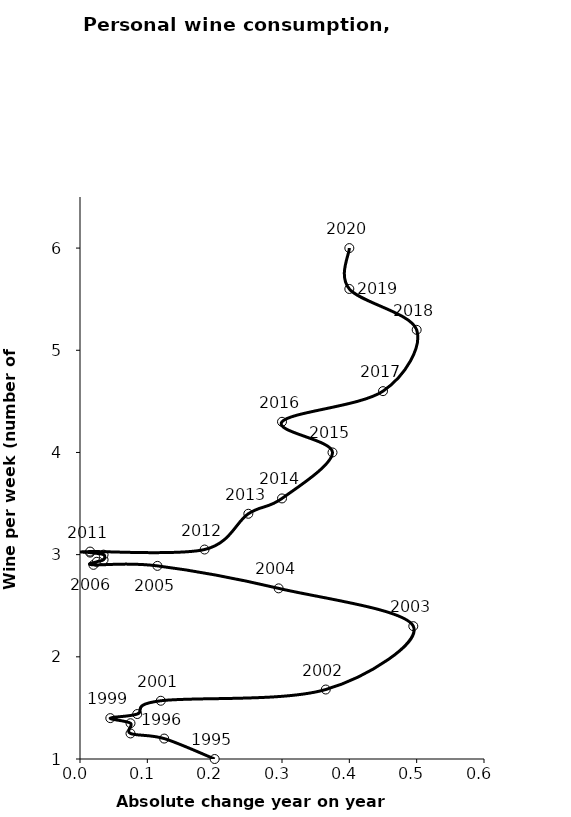
| Category | Series 0 |
|---|---|
| 0.19999999999999996 | 1 |
| 0.125 | 1.2 |
| 0.07500000000000007 | 1.25 |
| 0.07499999999999996 | 1.35 |
| 0.04499999999999993 | 1.4 |
| 0.08500000000000008 | 1.44 |
| 0.12 | 1.57 |
| 0.3649999999999999 | 1.68 |
| 0.495 | 2.3 |
| 0.29500000000000015 | 2.67 |
| 0.11499999999999999 | 2.89 |
| 0.020000000000000018 | 2.9 |
| 0.025000000000000133 | 2.93 |
| 0.03499999999999992 | 2.95 |
| 0.03499999999999992 | 3 |
| 0.014999999999999902 | 3.02 |
| 0.014999999999999902 | 3.03 |
| 0.18500000000000005 | 3.05 |
| 0.25 | 3.4 |
| 0.30000000000000004 | 3.55 |
| 0.375 | 4 |
| 0.2999999999999998 | 4.3 |
| 0.4500000000000002 | 4.6 |
| 0.5 | 5.2 |
| 0.3999999999999999 | 5.6 |
| 0.40000000000000036 | 6 |